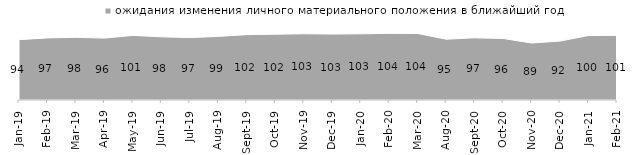
| Category | ожидания изменения личного материального положения в ближайший год |
|---|---|
| 2019-01-01 | 94.05 |
| 2019-02-01 | 96.75 |
| 2019-03-01 | 97.663 |
| 2019-04-01 | 96.436 |
| 2019-05-01 | 100.693 |
| 2019-06-01 | 98.404 |
| 2019-07-01 | 97.228 |
| 2019-08-01 | 99.151 |
| 2019-09-01 | 101.881 |
| 2019-10-01 | 102.475 |
| 2019-11-01 | 103.218 |
| 2019-12-01 | 102.772 |
| 2020-01-01 | 103.119 |
| 2020-02-01 | 103.861 |
| 2020-03-01 | 103.619 |
| 2020-08-01 | 94.786 |
| 2020-09-01 | 96.864 |
| 2020-10-01 | 95.914 |
| 2020-11-01 | 88.8 |
| 2020-12-01 | 91.82 |
| 2021-01-01 | 100.447 |
| 2021-02-01 | 100.645 |